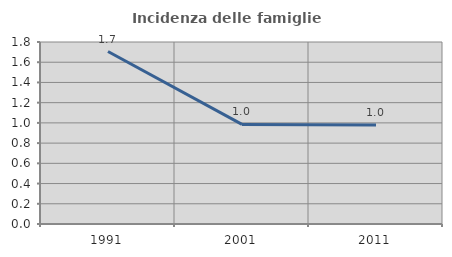
| Category | Incidenza delle famiglie numerose |
|---|---|
| 1991.0 | 1.706 |
| 2001.0 | 0.985 |
| 2011.0 | 0.979 |